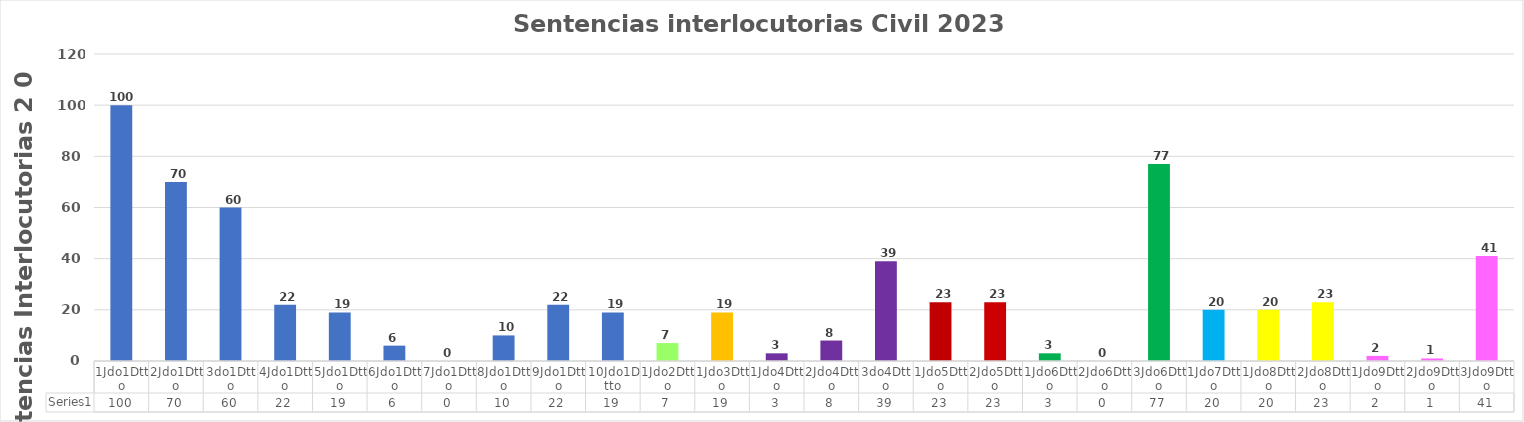
| Category | Series 0 |
|---|---|
| 1Jdo1Dtto | 100 |
| 2Jdo1Dtto | 70 |
| 3do1Dtto | 60 |
| 4Jdo1Dtto | 22 |
| 5Jdo1Dtto | 19 |
| 6Jdo1Dtto | 6 |
| 7Jdo1Dtto | 0 |
| 8Jdo1Dtto | 10 |
| 9Jdo1Dtto | 22 |
| 10Jdo1Dtto | 19 |
| 1Jdo2Dtto | 7 |
| 1Jdo3Dtto | 19 |
| 1Jdo4Dtto | 3 |
| 2Jdo4Dtto | 8 |
| 3do4Dtto | 39 |
| 1Jdo5Dtto | 23 |
| 2Jdo5Dtto | 23 |
| 1Jdo6Dtto | 3 |
| 2Jdo6Dtto | 0 |
| 3Jdo6Dtto | 77 |
| 1Jdo7Dtto | 20 |
| 1Jdo8Dtto | 20 |
| 2Jdo8Dtto | 23 |
| 1Jdo9Dtto | 2 |
| 2Jdo9Dtto | 1 |
| 3Jdo9Dtto | 41 |